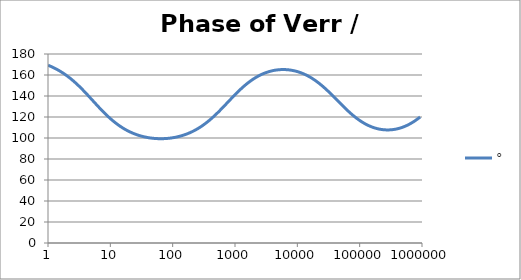
| Category | ° |
|---|---|
| 1.0 | 169.328 |
| 1.0715193052376064 | 168.584 |
| 1.1481536214968828 | 167.792 |
| 1.2302687708123814 | 166.948 |
| 1.318256738556407 | 166.051 |
| 1.4125375446227544 | 165.097 |
| 1.513561248436208 | 164.085 |
| 1.6218100973589298 | 163.012 |
| 1.7378008287493754 | 161.875 |
| 1.8620871366628673 | 160.674 |
| 1.9952623149688797 | 159.407 |
| 2.1379620895022318 | 158.073 |
| 2.2908676527677727 | 156.671 |
| 2.45470891568503 | 155.202 |
| 2.6302679918953817 | 153.666 |
| 2.8183829312644537 | 152.066 |
| 3.0199517204020156 | 150.403 |
| 3.235936569296282 | 148.682 |
| 3.467368504525316 | 146.908 |
| 3.7153522909717256 | 145.084 |
| 3.9810717055349727 | 143.219 |
| 4.265795188015926 | 141.32 |
| 4.570881896148749 | 139.394 |
| 4.897788193684462 | 137.45 |
| 5.2480746024977245 | 135.499 |
| 5.62341325190349 | 133.548 |
| 6.025595860743575 | 131.609 |
| 6.456542290346554 | 129.689 |
| 6.918309709189363 | 127.799 |
| 7.4131024130091765 | 125.946 |
| 7.943282347242814 | 124.137 |
| 8.511380382023765 | 122.381 |
| 9.120108393559095 | 120.682 |
| 9.772372209558105 | 119.045 |
| 10.47128548050899 | 117.474 |
| 11.22018454301963 | 115.972 |
| 12.022644346174127 | 114.541 |
| 12.88249551693134 | 113.182 |
| 13.803842646028851 | 111.896 |
| 14.791083881682074 | 110.683 |
| 15.848931924611136 | 109.541 |
| 16.98243652461744 | 108.471 |
| 18.197008586099834 | 107.47 |
| 19.498445997580447 | 106.538 |
| 20.892961308540382 | 105.671 |
| 22.387211385683386 | 104.869 |
| 23.988329190194897 | 104.129 |
| 25.703957827688622 | 103.449 |
| 27.54228703338165 | 102.828 |
| 29.51209226666385 | 102.263 |
| 31.62277660168379 | 101.753 |
| 33.884415613920254 | 101.296 |
| 36.307805477010106 | 100.889 |
| 38.90451449942804 | 100.533 |
| 41.686938347033525 | 100.225 |
| 44.6683592150963 | 99.964 |
| 47.86300923226381 | 99.75 |
| 51.28613839913647 | 99.58 |
| 54.95408738576247 | 99.456 |
| 58.88436553555889 | 99.376 |
| 63.09573444801931 | 99.34 |
| 67.60829753919813 | 99.347 |
| 72.44359600749901 | 99.399 |
| 77.62471166286915 | 99.494 |
| 83.17637711026705 | 99.634 |
| 89.12509381337456 | 99.819 |
| 95.49925860214357 | 100.049 |
| 102.32929922807544 | 100.326 |
| 109.64781961431841 | 100.65 |
| 117.48975549395293 | 101.023 |
| 125.89254117941665 | 101.447 |
| 134.89628825916537 | 101.921 |
| 144.54397707459273 | 102.45 |
| 154.88166189124806 | 103.033 |
| 165.95869074375608 | 103.673 |
| 177.82794100389225 | 104.371 |
| 190.5460717963248 | 105.13 |
| 204.17379446695278 | 105.952 |
| 218.77616239495524 | 106.838 |
| 234.42288153199212 | 107.79 |
| 251.18864315095806 | 108.81 |
| 269.15348039269156 | 109.898 |
| 288.4031503126605 | 111.057 |
| 309.0295432513591 | 112.287 |
| 331.1311214825911 | 113.588 |
| 354.81338923357566 | 114.959 |
| 380.18939632056095 | 116.4 |
| 407.3802778041123 | 117.909 |
| 436.5158322401654 | 119.482 |
| 467.7351412871979 | 121.117 |
| 501.18723362727184 | 122.809 |
| 537.0317963702526 | 124.552 |
| 575.4399373371566 | 126.339 |
| 616.5950018614822 | 128.163 |
| 660.6934480075952 | 130.016 |
| 707.9457843841375 | 131.889 |
| 758.5775750291831 | 133.772 |
| 812.8305161640983 | 135.656 |
| 870.9635899560801 | 137.53 |
| 933.2543007969903 | 139.386 |
| 999.9999999999998 | 141.213 |
| 1071.5193052376057 | 143.002 |
| 1148.1536214968828 | 144.747 |
| 1230.2687708123801 | 146.438 |
| 1318.2567385564053 | 148.07 |
| 1412.537544622753 | 149.638 |
| 1513.5612484362066 | 151.137 |
| 1621.8100973589292 | 152.562 |
| 1737.8008287493742 | 153.913 |
| 1862.0871366628671 | 155.185 |
| 1995.2623149688786 | 156.38 |
| 2137.9620895022326 | 157.495 |
| 2290.867652767771 | 158.53 |
| 2454.708915685027 | 159.487 |
| 2630.26799189538 | 160.366 |
| 2818.382931264451 | 161.167 |
| 3019.9517204020176 | 161.891 |
| 3235.9365692962774 | 162.541 |
| 3467.368504525316 | 163.117 |
| 3715.352290971724 | 163.62 |
| 3981.07170553497 | 164.051 |
| 4265.795188015923 | 164.412 |
| 4570.881896148745 | 164.704 |
| 4897.788193684463 | 164.926 |
| 5248.074602497726 | 165.08 |
| 5623.413251903489 | 165.167 |
| 6025.595860743574 | 165.186 |
| 6456.54229034655 | 165.137 |
| 6918.309709189357 | 165.021 |
| 7413.102413009165 | 164.837 |
| 7943.282347242815 | 164.585 |
| 8511.380382023763 | 164.264 |
| 9120.108393559092 | 163.873 |
| 9772.3722095581 | 163.411 |
| 10471.285480509003 | 162.878 |
| 11220.184543019639 | 162.272 |
| 12022.64434617411 | 161.592 |
| 12882.495516931338 | 160.837 |
| 13803.842646028841 | 160.006 |
| 14791.083881682063 | 159.098 |
| 15848.931924611119 | 158.113 |
| 16982.436524617453 | 157.05 |
| 18197.008586099837 | 155.909 |
| 19498.445997580417 | 154.692 |
| 20892.961308540387 | 153.398 |
| 22387.211385683382 | 152.031 |
| 23988.32919019488 | 150.592 |
| 25703.957827688606 | 149.085 |
| 27542.28703338167 | 147.515 |
| 29512.092266663854 | 145.887 |
| 31622.77660168378 | 144.207 |
| 33884.41561392023 | 142.484 |
| 36307.805477010166 | 140.724 |
| 38904.514499428085 | 138.937 |
| 41686.93834703348 | 137.132 |
| 44668.35921509631 | 135.32 |
| 47863.00923226382 | 133.51 |
| 51286.13839913646 | 131.713 |
| 54954.08738576241 | 129.939 |
| 58884.365535558936 | 128.197 |
| 63095.73444801934 | 126.496 |
| 67608.29753919817 | 124.844 |
| 72443.59600749899 | 123.249 |
| 77624.71166286913 | 121.717 |
| 83176.37711026703 | 120.254 |
| 89125.09381337445 | 118.864 |
| 95499.25860214363 | 117.55 |
| 102329.29922807543 | 116.316 |
| 109647.81961431848 | 115.163 |
| 117489.75549395289 | 114.093 |
| 125892.54117941685 | 113.106 |
| 134896.28825916522 | 112.203 |
| 144543.97707459255 | 111.385 |
| 154881.66189124787 | 110.65 |
| 165958.69074375575 | 109.997 |
| 177827.9410038922 | 109.428 |
| 190546.07179632425 | 108.94 |
| 204173.79446695274 | 108.533 |
| 218776.16239495497 | 108.207 |
| 234422.88153199226 | 107.96 |
| 251188.64315095753 | 107.794 |
| 269153.480392691 | 107.706 |
| 288403.15031266044 | 107.697 |
| 309029.5432513582 | 107.768 |
| 331131.1214825907 | 107.917 |
| 354813.3892335749 | 108.146 |
| 380189.3963205612 | 108.455 |
| 407380.2778041119 | 108.845 |
| 436515.8322401649 | 109.316 |
| 467735.14128719777 | 109.87 |
| 501187.2336272717 | 110.506 |
| 537031.7963702519 | 111.225 |
| 575439.9373371559 | 112.03 |
| 616595.001861482 | 112.919 |
| 660693.4480075944 | 113.893 |
| 707945.7843841374 | 114.952 |
| 758577.575029183 | 116.097 |
| 812830.5161640996 | 117.325 |
| 870963.5899560791 | 118.635 |
| 933254.3007969892 | 120.026 |